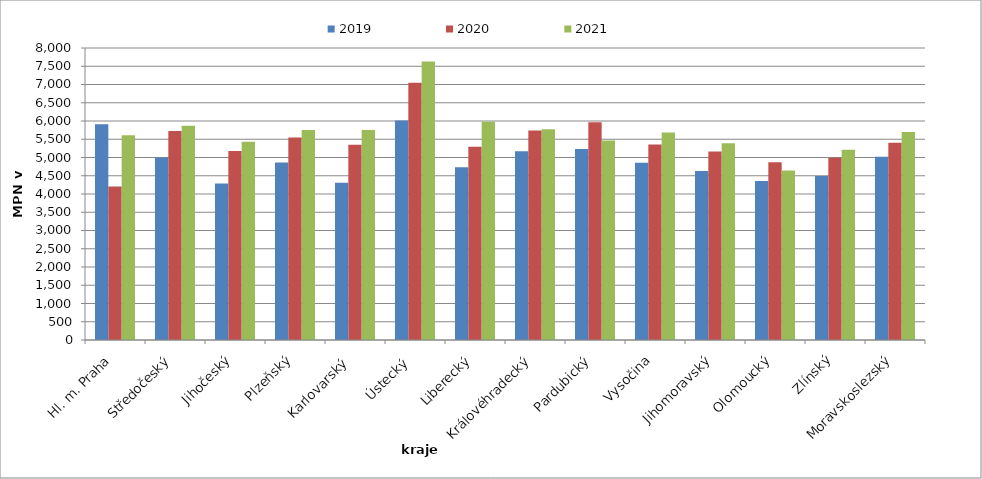
| Category | 2019 | 2020 | 2021 |
|---|---|---|---|
| Hl. m. Praha | 5913 | 4204 | 5607 |
| Středočeský | 4999 | 5726 | 5871 |
| Jihočeský | 4291 | 5176 | 5430 |
| Plzeňský | 4864 | 5548 | 5756 |
| Karlovarský  | 4308 | 5350 | 5752 |
| Ústecký   | 6014 | 7050 | 7627 |
| Liberecký | 4736 | 5295 | 5981 |
| Královéhradecký | 5170 | 5739 | 5775 |
| Pardubický | 5234 | 5966 | 5463 |
| Vysočina | 4857 | 5359 | 5687 |
| Jihomoravský | 4632 | 5165 | 5389 |
| Olomoucký | 4354 | 4869 | 4644 |
| Zlínský | 4490 | 4994 | 5213 |
| Moravskoslezský | 5018 | 5407 | 5696 |